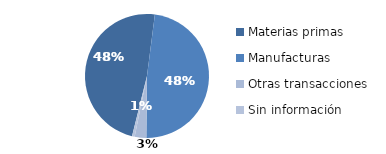
| Category | Series 0 |
|---|---|
| Materias primas | 114.38 |
| Manufacturas | 114.386 |
| Otras transacciones | 7.205 |
| Sin información | 1.633 |